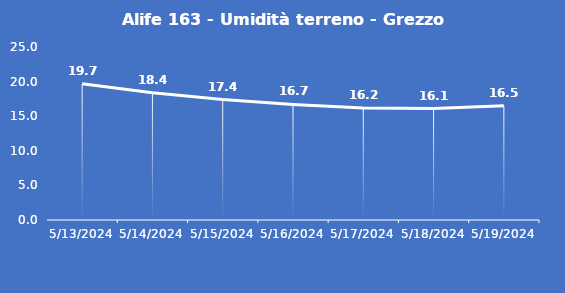
| Category | Alife 163 - Umidità terreno - Grezzo (%VWC) |
|---|---|
| 5/13/24 | 19.7 |
| 5/14/24 | 18.4 |
| 5/15/24 | 17.4 |
| 5/16/24 | 16.7 |
| 5/17/24 | 16.2 |
| 5/18/24 | 16.1 |
| 5/19/24 | 16.5 |